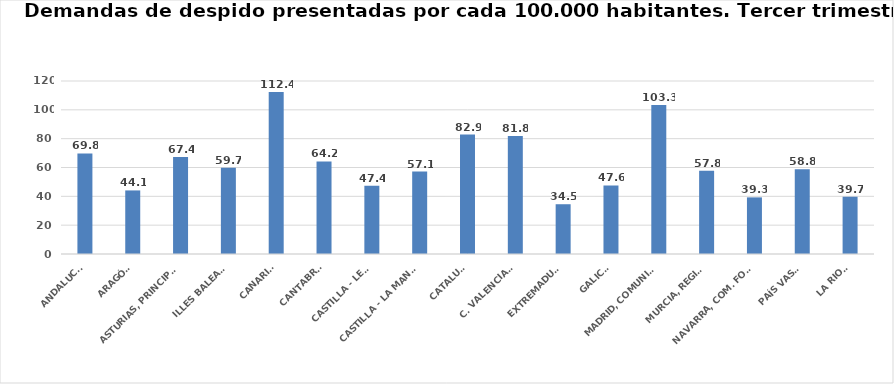
| Category | Series 0 |
|---|---|
| ANDALUCÍA | 69.787 |
| ARAGÓN | 44.096 |
| ASTURIAS, PRINCIPADO | 67.355 |
| ILLES BALEARS | 59.748 |
| CANARIAS | 112.431 |
| CANTABRIA | 64.228 |
| CASTILLA - LEÓN | 47.386 |
| CASTILLA - LA MANCHA | 57.146 |
| CATALUÑA | 82.858 |
| C. VALENCIANA | 81.79 |
| EXTREMADURA | 34.525 |
| GALICIA | 47.561 |
| MADRID, COMUNIDAD | 103.315 |
| MURCIA, REGIÓN | 57.771 |
| NAVARRA, COM. FORAL | 39.274 |
| PAÍS VASCO | 58.831 |
| LA RIOJA | 39.719 |